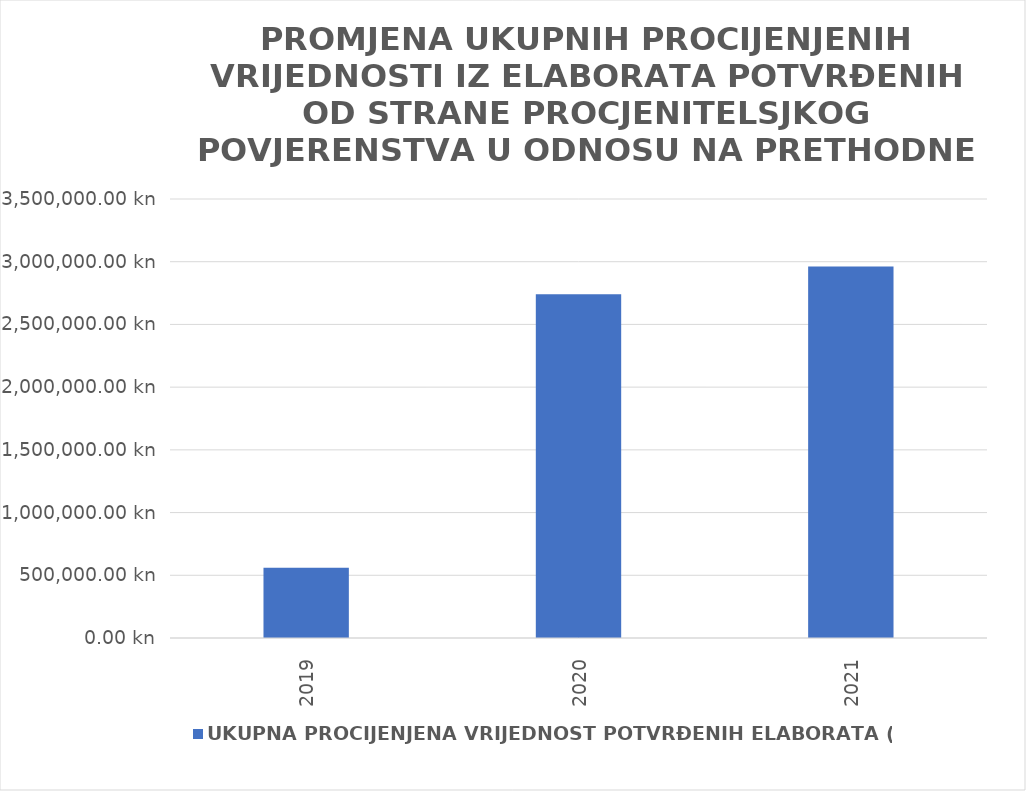
| Category | UKUPNA PROCIJENJENA VRIJEDNOST POTVRĐENIH ELABORATA (u kn) |
|---|---|
| 2019.0 | 559440 |
| 2020.0 | 2739636 |
| 2021.0 | 2961376 |